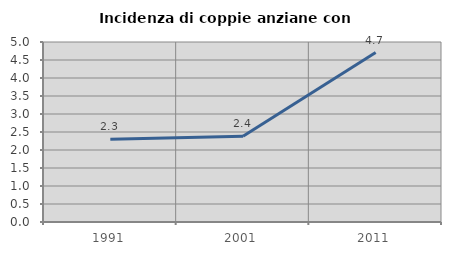
| Category | Incidenza di coppie anziane con figli |
|---|---|
| 1991.0 | 2.299 |
| 2001.0 | 2.381 |
| 2011.0 | 4.706 |